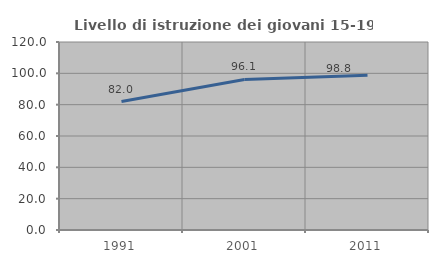
| Category | Livello di istruzione dei giovani 15-19 anni |
|---|---|
| 1991.0 | 82 |
| 2001.0 | 96.124 |
| 2011.0 | 98.765 |